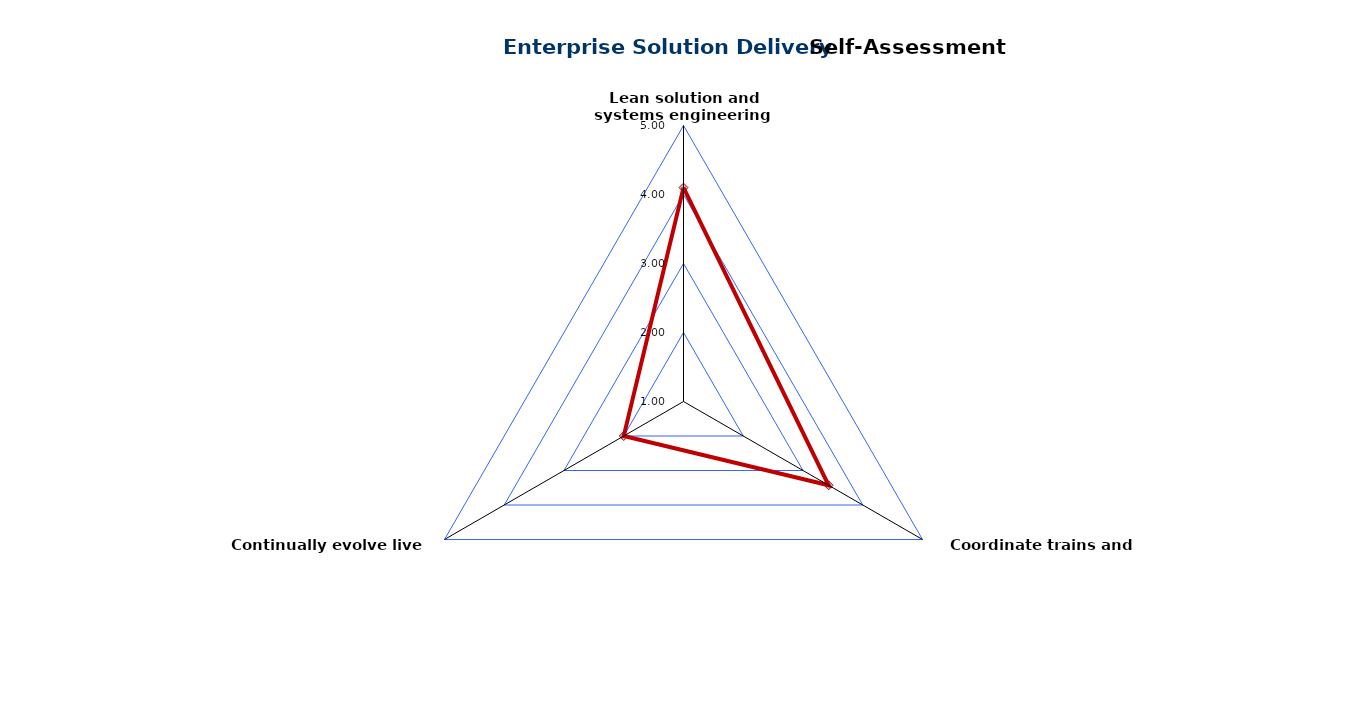
| Category | Enterprise Solution Delivery |
|---|---|
| Lean solution and systems engineering  | 4.1 |
| Coordinate trains and suppliers | 3.429 |
| Continually evolve live systems | 2 |